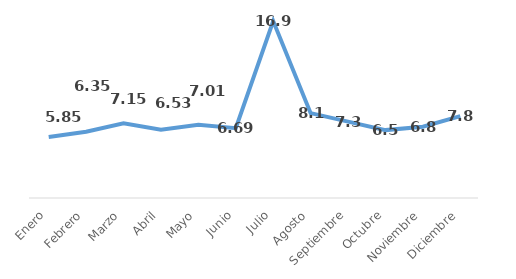
| Category | Días hábiles |
|---|---|
| Enero | 5.85 |
| Febrero | 6.35 |
| Marzo | 7.15 |
| Abril | 6.53 |
| Mayo | 7.01 |
| Junio | 6.69 |
| Julio | 16.941 |
| Agosto | 8.125 |
| Septiembre | 7.312 |
| Octubre | 6.5 |
| Noviembre | 6.818 |
| Diciembre | 7.846 |